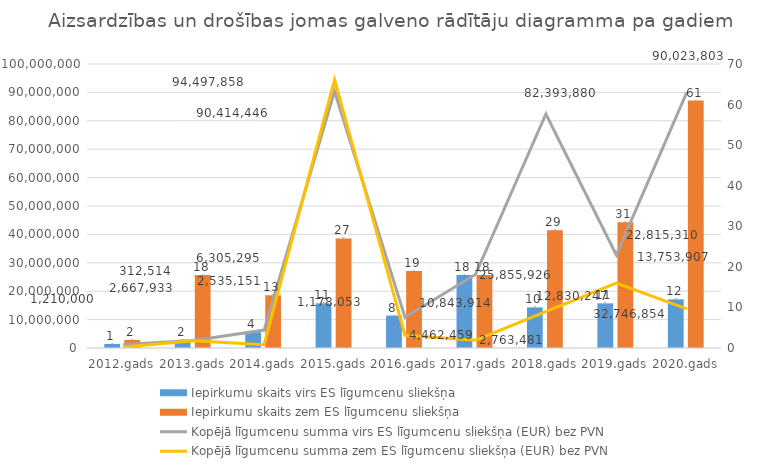
| Category | Iepirkumu skaits virs ES līgumcenu sliekšņa | Iepirkumu skaits zem ES līgumcenu sliekšņa |
|---|---|---|
| 2012.gads | 1 | 2 |
| 2013.gads | 2 | 18 |
| 2014.gads | 4 | 13 |
| 2015.gads | 11 | 27 |
| 2016.gads | 8 | 19 |
| 2017.gads | 18 | 18 |
| 2018.gads | 10 | 29 |
| 2019.gads | 11 | 31 |
| 2020.gads | 12 | 61 |